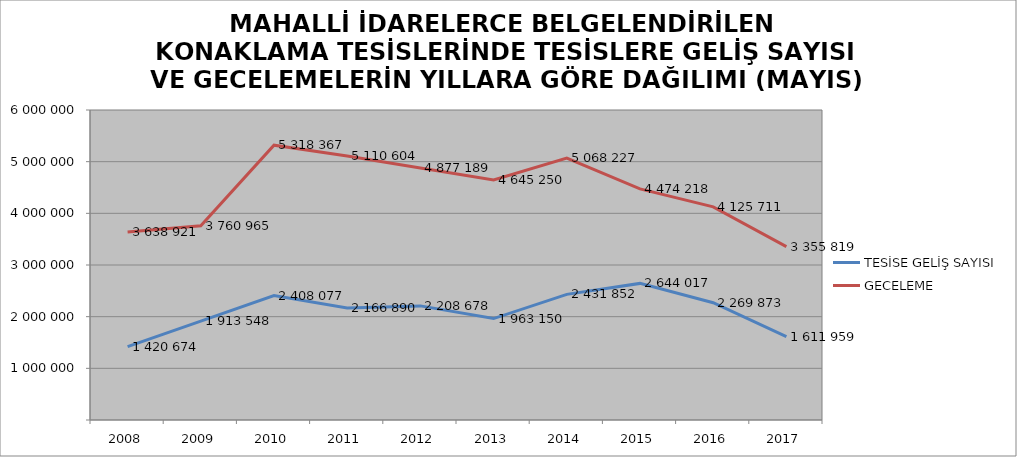
| Category | TESİSE GELİŞ SAYISI | GECELEME |
|---|---|---|
| 2008 | 1420674 | 3638921 |
| 2009 | 1913548 | 3760965 |
| 2010 | 2408077 | 5318367 |
| 2011 | 2166890 | 5110604 |
| 2012 | 2208678 | 4877189 |
| 2013 | 1963150 | 4645250 |
| 2014 | 2431852 | 5068227 |
| 2015 | 2644017 | 4474218 |
| 2016 | 2269873 | 4125711 |
| 2017 | 1611959 | 3355819 |